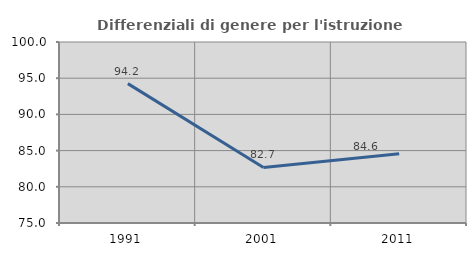
| Category | Differenziali di genere per l'istruzione superiore |
|---|---|
| 1991.0 | 94.249 |
| 2001.0 | 82.669 |
| 2011.0 | 84.559 |